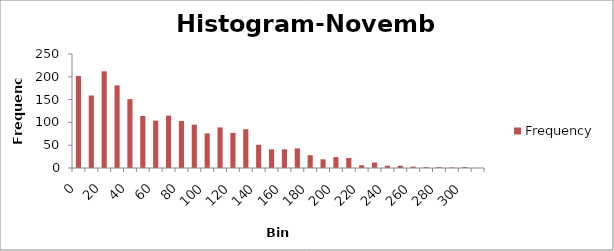
| Category | Frequency |
|---|---|
| 0 | 202 |
| 10 | 159 |
| 20 | 212 |
| 30 | 181 |
| 40 | 151 |
| 50 | 114 |
| 60 | 104 |
| 70 | 115 |
| 80 | 103 |
| 90 | 95 |
| 100 | 76 |
| 110 | 89 |
| 120 | 77 |
| 130 | 85 |
| 140 | 51 |
| 150 | 41 |
| 160 | 41 |
| 170 | 43 |
| 180 | 28 |
| 190 | 19 |
| 200 | 24 |
| 210 | 22 |
| 220 | 6 |
| 230 | 12 |
| 240 | 5 |
| 250 | 5 |
| 260 | 3 |
| 270 | 2 |
| 280 | 2 |
| 290 | 1 |
| 300 | 2 |
| More | 0 |